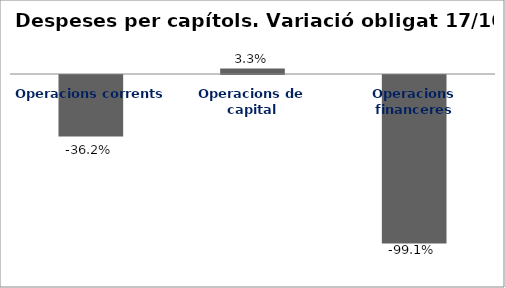
| Category | Series 0 |
|---|---|
| Operacions corrents | -0.362 |
| Operacions de capital | 0.032 |
| Operacions financeres | -0.991 |